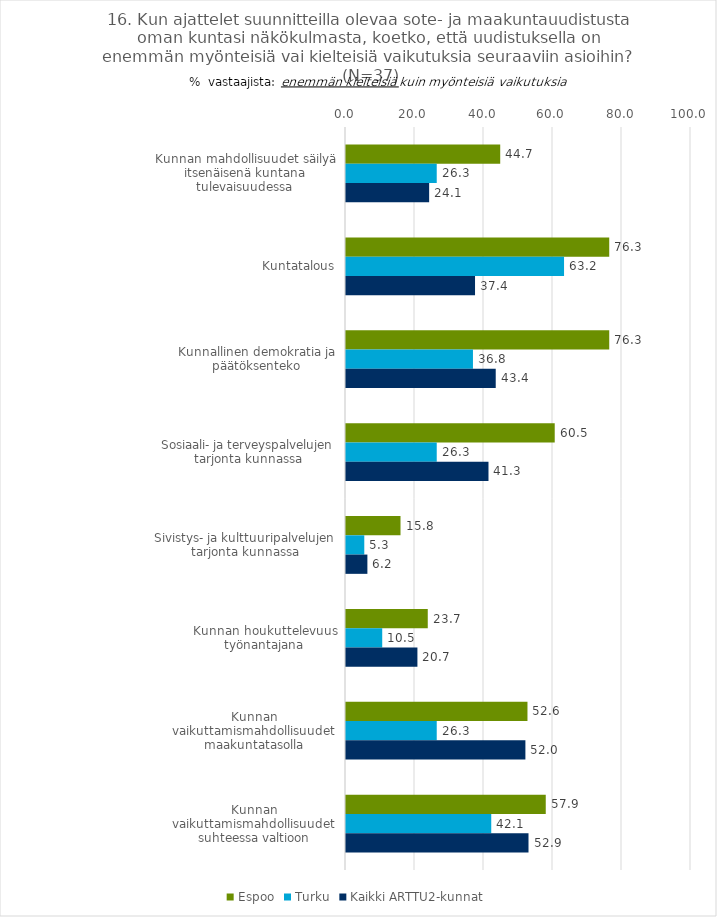
| Category | Espoo | Turku | Kaikki ARTTU2-kunnat |
|---|---|---|---|
| Kunnan mahdollisuudet säilyä itsenäisenä kuntana tulevaisuudessa | 44.7 | 26.3 | 24.1 |
| Kuntatalous | 76.3 | 63.2 | 37.4 |
| Kunnallinen demokratia ja päätöksenteko | 76.3 | 36.8 | 43.4 |
| Sosiaali- ja terveyspalvelujen tarjonta kunnassa | 60.5 | 26.3 | 41.3 |
| Sivistys- ja kulttuuripalvelujen tarjonta kunnassa | 15.8 | 5.3 | 6.2 |
| Kunnan houkuttelevuus työnantajana | 23.7 | 10.5 | 20.7 |
| Kunnan vaikuttamismahdollisuudet maakuntatasolla | 52.6 | 26.3 | 52 |
| Kunnan vaikuttamismahdollisuudet suhteessa valtioon | 57.9 | 42.1 | 52.9 |